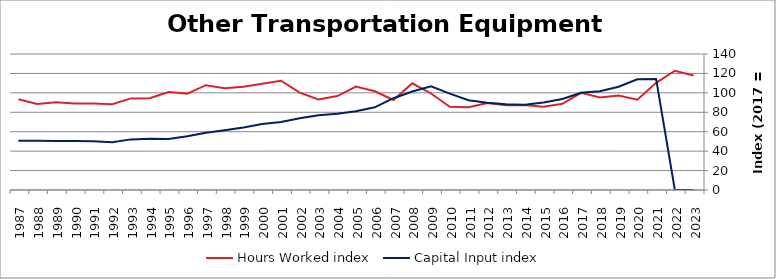
| Category | Hours Worked index | Capital Input index |
|---|---|---|
| 2023.0 | 117.938 | 0 |
| 2022.0 | 122.772 | 0 |
| 2021.0 | 110.289 | 114.364 |
| 2020.0 | 92.889 | 113.919 |
| 2019.0 | 97.168 | 106.308 |
| 2018.0 | 95.257 | 101.615 |
| 2017.0 | 100 | 100 |
| 2016.0 | 88.695 | 93.741 |
| 2015.0 | 85.716 | 89.979 |
| 2014.0 | 87.481 | 87.821 |
| 2013.0 | 87.308 | 88.204 |
| 2012.0 | 89.613 | 89.72 |
| 2011.0 | 85.146 | 92.482 |
| 2010.0 | 85.634 | 99.258 |
| 2009.0 | 99.348 | 106.73 |
| 2008.0 | 109.812 | 101.351 |
| 2007.0 | 92.669 | 94.477 |
| 2006.0 | 101.657 | 85.109 |
| 2005.0 | 106.56 | 81.106 |
| 2004.0 | 96.691 | 78.397 |
| 2003.0 | 93.157 | 76.978 |
| 2002.0 | 100.246 | 73.839 |
| 2001.0 | 112.437 | 70.052 |
| 2000.0 | 109.445 | 67.91 |
| 1999.0 | 106.258 | 64.443 |
| 1998.0 | 104.826 | 61.479 |
| 1997.0 | 107.906 | 58.873 |
| 1996.0 | 99.219 | 55.233 |
| 1995.0 | 100.852 | 52.52 |
| 1994.0 | 94.441 | 52.634 |
| 1993.0 | 94.317 | 52.108 |
| 1992.0 | 88.269 | 49.23 |
| 1991.0 | 89.008 | 50.081 |
| 1990.0 | 88.923 | 50.447 |
| 1989.0 | 90.384 | 50.321 |
| 1988.0 | 88.657 | 50.702 |
| 1987.0 | 93.36 | 50.739 |